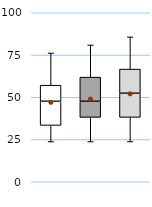
| Category | 25th | 50th | 75th |
|---|---|---|---|
| UK | 33.333 | 14.286 | 9.524 |
| Top 50% | 38.095 | 9.524 | 14.286 |
| Top 10% | 38.095 | 14.286 | 14.286 |